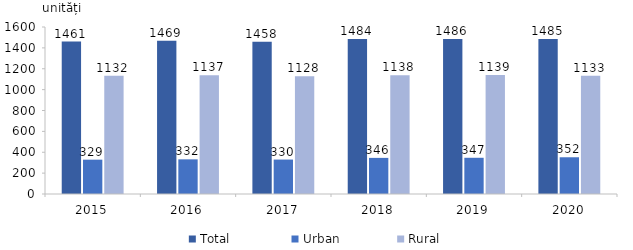
| Category | Total  | Urban | Rural |
|---|---|---|---|
| 2015.0 | 1461 | 329 | 1132 |
| 2016.0 | 1469 | 332 | 1137 |
| 2017.0 | 1458 | 330 | 1128 |
| 2018.0 | 1484 | 346 | 1138 |
| 2019.0 | 1486 | 347 | 1139 |
| 2020.0 | 1485 | 352 | 1133 |